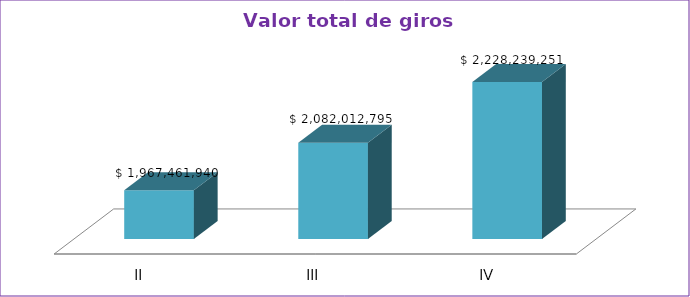
| Category | Series 0 |
|---|---|
| II | 1967461940 |
| III | 2082012795 |
| IV | 2228239251 |